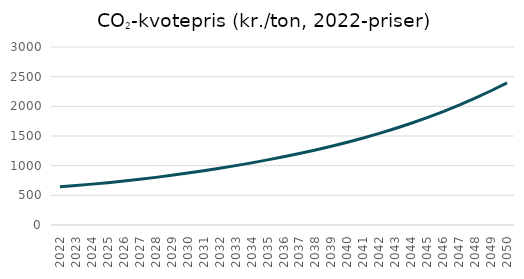
| Category | CO2-kvoter |
|---|---|
| 2022.0 | 645.2 |
| 2023.0 | 666.59 |
| 2024.0 | 688.99 |
| 2025.0 | 713.64 |
| 2026.0 | 741.33 |
| 2027.0 | 771.28 |
| 2028.0 | 802.71 |
| 2029.0 | 837.73 |
| 2030.0 | 875.36 |
| 2031.0 | 914.8 |
| 2032.0 | 956.44 |
| 2033.0 | 1000.59 |
| 2034.0 | 1047.37 |
| 2035.0 | 1097.4 |
| 2036.0 | 1149.38 |
| 2037.0 | 1204.66 |
| 2038.0 | 1263.8 |
| 2039.0 | 1326.72 |
| 2040.0 | 1394.45 |
| 2041.0 | 1466.47 |
| 2042.0 | 1543.69 |
| 2043.0 | 1626.5 |
| 2044.0 | 1715.17 |
| 2045.0 | 1810.27 |
| 2046.0 | 1911.97 |
| 2047.0 | 2020.86 |
| 2048.0 | 2137.69 |
| 2049.0 | 2262.31 |
| 2050.0 | 2396.01 |